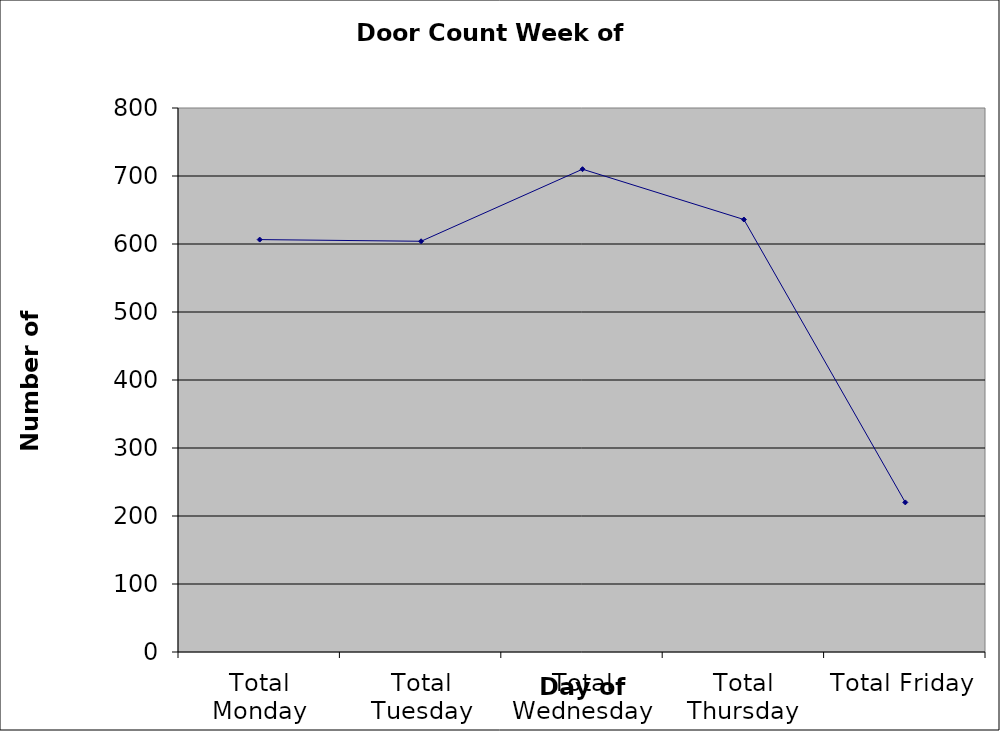
| Category | Series 0 |
|---|---|
| Total Monday | 606.5 |
| Total Tuesday | 604 |
| Total Wednesday | 710 |
| Total Thursday | 636 |
| Total Friday | 220 |